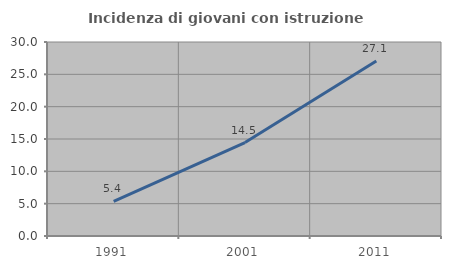
| Category | Incidenza di giovani con istruzione universitaria |
|---|---|
| 1991.0 | 5.357 |
| 2001.0 | 14.451 |
| 2011.0 | 27.068 |